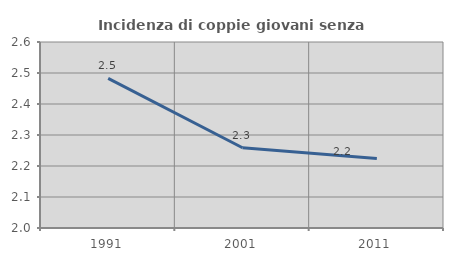
| Category | Incidenza di coppie giovani senza figli |
|---|---|
| 1991.0 | 2.483 |
| 2001.0 | 2.259 |
| 2011.0 | 2.224 |